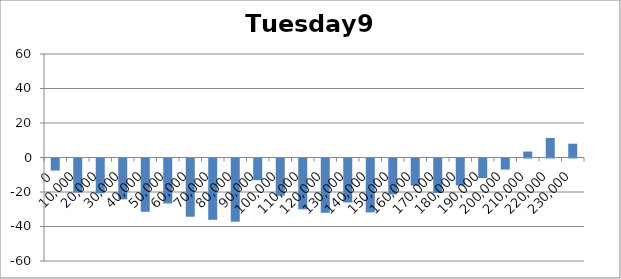
| Category | Tuesday96 |
|---|---|
| 0.0 | -6.99 |
| 10000.0 | -19.775 |
| 20000.0 | -20.245 |
| 30000.0 | -23.69 |
| 40000.0 | -30.87 |
| 50000.0 | -26.07 |
| 60000.0 | -33.74 |
| 70000.0 | -35.525 |
| 80000.0 | -36.635 |
| 90000.0 | -12.575 |
| 100000.0 | -21.61 |
| 110000.0 | -29.47 |
| 120000.0 | -31.45 |
| 130000.0 | -25.475 |
| 140000.0 | -31.25 |
| 150000.0 | -20.865 |
| 160000.0 | -15.685 |
| 170000.0 | -20 |
| 180000.0 | -15.59 |
| 190000.0 | -11.35 |
| 200000.0 | -6.425 |
| 210000.0 | 3.45 |
| 220000.0 | 11.327 |
| 230000.0 | 8.01 |